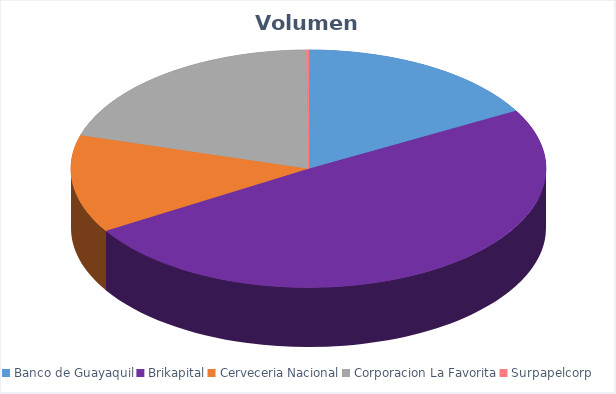
| Category | VOLUMEN ($USD) |
|---|---|
| Banco de Guayaquil | 34265 |
| Brikapital | 100000 |
| Cerveceria Nacional | 27000 |
| Corporacion La Favorita | 41149.4 |
| Surpapelcorp | 297.5 |